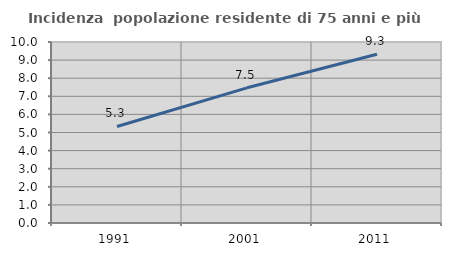
| Category | Incidenza  popolazione residente di 75 anni e più |
|---|---|
| 1991.0 | 5.333 |
| 2001.0 | 7.468 |
| 2011.0 | 9.321 |